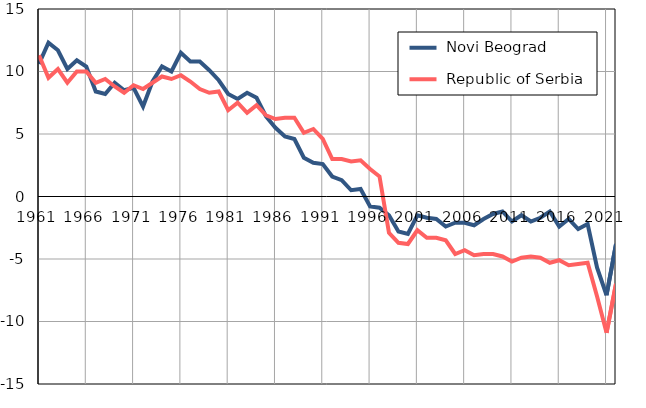
| Category |  Novi Beograd |  Republic of Serbia |
|---|---|---|
| 1961.0 | 10.6 | 11.3 |
| 1962.0 | 12.3 | 9.5 |
| 1963.0 | 11.7 | 10.2 |
| 1964.0 | 10.2 | 9.1 |
| 1965.0 | 10.9 | 10 |
| 1966.0 | 10.4 | 10 |
| 1967.0 | 8.4 | 9.1 |
| 1968.0 | 8.2 | 9.4 |
| 1969.0 | 9.1 | 8.8 |
| 1970.0 | 8.5 | 8.3 |
| 1971.0 | 8.7 | 8.9 |
| 1972.0 | 7.2 | 8.6 |
| 1973.0 | 9.2 | 9.1 |
| 1974.0 | 10.4 | 9.6 |
| 1975.0 | 10 | 9.4 |
| 1976.0 | 11.5 | 9.7 |
| 1977.0 | 10.8 | 9.2 |
| 1978.0 | 10.8 | 8.6 |
| 1979.0 | 10.1 | 8.3 |
| 1980.0 | 9.3 | 8.4 |
| 1981.0 | 8.2 | 6.9 |
| 1982.0 | 7.8 | 7.5 |
| 1983.0 | 8.3 | 6.7 |
| 1984.0 | 7.9 | 7.3 |
| 1985.0 | 6.4 | 6.5 |
| 1986.0 | 5.5 | 6.2 |
| 1987.0 | 4.8 | 6.3 |
| 1988.0 | 4.6 | 6.3 |
| 1989.0 | 3.1 | 5.1 |
| 1990.0 | 2.7 | 5.4 |
| 1991.0 | 2.6 | 4.6 |
| 1992.0 | 1.6 | 3 |
| 1993.0 | 1.3 | 3 |
| 1994.0 | 0.5 | 2.8 |
| 1995.0 | 0.6 | 2.9 |
| 1996.0 | -0.8 | 2.2 |
| 1997.0 | -0.9 | 1.6 |
| 1998.0 | -1.5 | -2.9 |
| 1999.0 | -2.8 | -3.7 |
| 2000.0 | -3 | -3.8 |
| 2001.0 | -1.5 | -2.7 |
| 2002.0 | -1.7 | -3.3 |
| 2003.0 | -1.8 | -3.3 |
| 2004.0 | -2.4 | -3.5 |
| 2005.0 | -2.1 | -4.6 |
| 2006.0 | -2.1 | -4.3 |
| 2007.0 | -2.3 | -4.7 |
| 2008.0 | -1.8 | -4.6 |
| 2009.0 | -1.4 | -4.6 |
| 2010.0 | -1.2 | -4.8 |
| 2011.0 | -2 | -5.2 |
| 2012.0 | -1.5 | -4.9 |
| 2013.0 | -2 | -4.8 |
| 2014.0 | -1.7 | -4.9 |
| 2015.0 | -1.2 | -5.3 |
| 2016.0 | -2.4 | -5.1 |
| 2017.0 | -1.8 | -5.5 |
| 2018.0 | -2.6 | -5.4 |
| 2019.0 | -2.2 | -5.3 |
| 2020.0 | -5.7 | -8 |
| 2021.0 | -7.9 | -10.9 |
| 2022.0 | -3.8 | -7 |